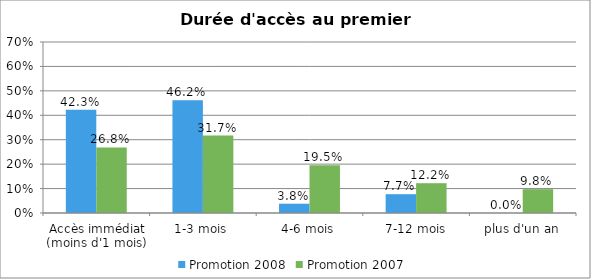
| Category | Promotion 2008 | Promotion 2007 |
|---|---|---|
| Accès immédiat (moins d'1 mois) | 0.423 | 0.268 |
| 1-3 mois | 0.462 | 0.317 |
| 4-6 mois | 0.038 | 0.195 |
| 7-12 mois | 0.077 | 0.122 |
| plus d'un an | 0 | 0.098 |